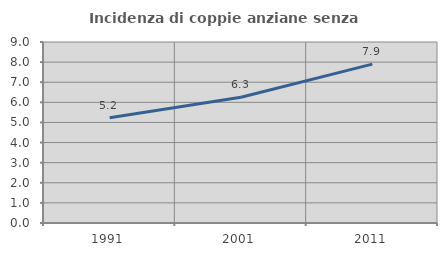
| Category | Incidenza di coppie anziane senza figli  |
|---|---|
| 1991.0 | 5.231 |
| 2001.0 | 6.25 |
| 2011.0 | 7.899 |